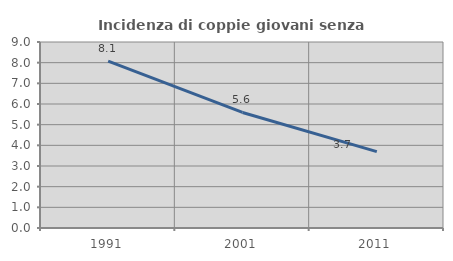
| Category | Incidenza di coppie giovani senza figli |
|---|---|
| 1991.0 | 8.076 |
| 2001.0 | 5.591 |
| 2011.0 | 3.696 |